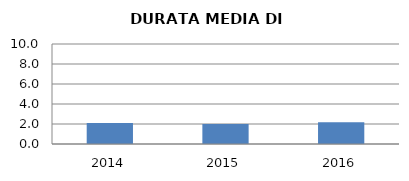
| Category | 2014 2015 2016 |
|---|---|
| 2014.0 | 2.1 |
| 2015.0 | 2 |
| 2016.0 | 2.167 |